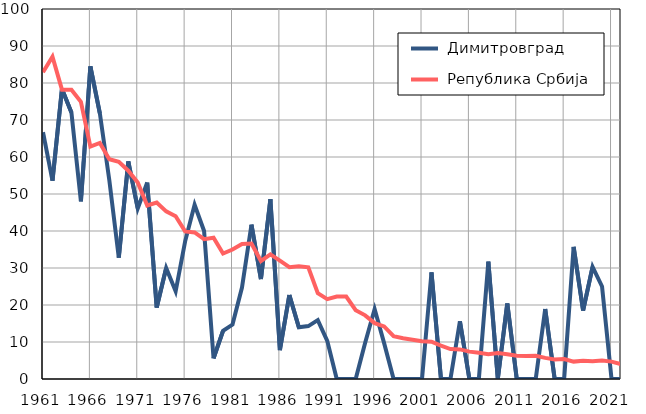
| Category |  Димитровград |  Република Србија |
|---|---|---|
| 1961.0 | 66.7 | 82.9 |
| 1962.0 | 53.6 | 87.1 |
| 1963.0 | 78.4 | 78.2 |
| 1964.0 | 72 | 78.2 |
| 1965.0 | 48 | 74.9 |
| 1966.0 | 84.5 | 62.8 |
| 1967.0 | 71.8 | 63.8 |
| 1968.0 | 53.7 | 59.4 |
| 1969.0 | 32.8 | 58.7 |
| 1970.0 | 58.8 | 56.3 |
| 1971.0 | 46.1 | 53.1 |
| 1972.0 | 53.1 | 46.9 |
| 1973.0 | 19.3 | 47.7 |
| 1974.0 | 30 | 45.3 |
| 1975.0 | 23.7 | 44 |
| 1976.0 | 37.2 | 39.9 |
| 1977.0 | 47.1 | 39.6 |
| 1978.0 | 40 | 37.8 |
| 1979.0 | 5.6 | 38.2 |
| 1980.0 | 13 | 33.9 |
| 1981.0 | 14.7 | 35 |
| 1982.0 | 24.7 | 36.5 |
| 1983.0 | 41.7 | 36.6 |
| 1984.0 | 27 | 31.9 |
| 1985.0 | 48.6 | 33.7 |
| 1986.0 | 7.8 | 32 |
| 1987.0 | 22.7 | 30.2 |
| 1988.0 | 14 | 30.5 |
| 1989.0 | 14.3 | 30.2 |
| 1990.0 | 15.9 | 23.2 |
| 1991.0 | 10.3 | 21.6 |
| 1992.0 | 0 | 22.3 |
| 1993.0 | 0 | 22.3 |
| 1994.0 | 0 | 18.6 |
| 1995.0 | 9.8 | 17.2 |
| 1996.0 | 18.9 | 15.1 |
| 1997.0 | 9.7 | 14.2 |
| 1998.0 | 0 | 11.6 |
| 1999.0 | 0 | 11 |
| 2000.0 | 0 | 10.6 |
| 2001.0 | 0 | 10.2 |
| 2002.0 | 28.8 | 10.1 |
| 2003.0 | 0 | 9 |
| 2004.0 | 0 | 8.1 |
| 2005.0 | 15.6 | 8 |
| 2006.0 | 0 | 7.4 |
| 2007.0 | 0 | 7.1 |
| 2008.0 | 31.7 | 6.7 |
| 2009.0 | 0 | 7 |
| 2010.0 | 20.4 | 6.7 |
| 2011.0 | 0 | 6.3 |
| 2012.0 | 0 | 6.2 |
| 2013.0 | 0 | 6.3 |
| 2014.0 | 18.9 | 5.7 |
| 2015.0 | 0 | 5.3 |
| 2016.0 | 0 | 5.4 |
| 2017.0 | 35.7 | 4.7 |
| 2018.0 | 18.5 | 4.9 |
| 2019.0 | 30.3 | 4.8 |
| 2020.0 | 25 | 5 |
| 2021.0 | 0 | 4.7 |
| 2022.0 | 0 | 4 |